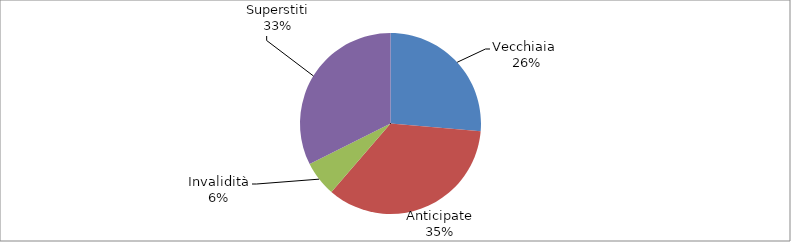
| Category | Series 0 |
|---|---|
| Vecchiaia  | 16530 |
| Anticipate | 21929 |
| Invalidità | 3931 |
| Superstiti | 20322 |